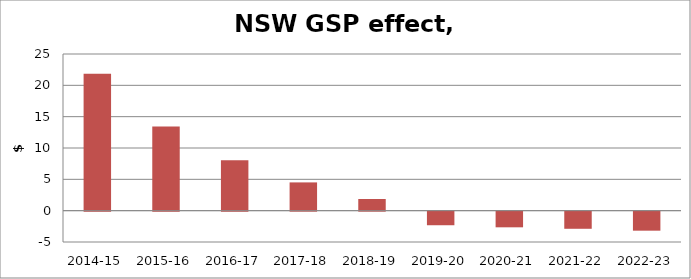
| Category | Series 0 |
|---|---|
| 2014-15 | 21.837 |
| 2015-16 | 13.44 |
| 2016-17 | 8.038 |
| 2017-18 | 4.51 |
| 2018-19 | 1.862 |
| 2019-20 | -2.165 |
| 2020-21 | -2.497 |
| 2021-22 | -2.731 |
| 2022-23 | -3.033 |